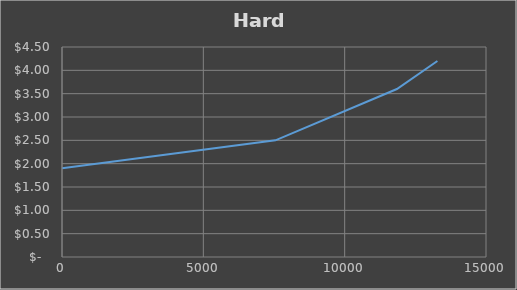
| Category | Series 0 |
|---|---|
| 0.0 | 1.9 |
| 3775.0 | 2.2 |
| 7550.0 | 2.5 |
| 11848.25 | 3.6 |
| 13281.0 | 4.2 |